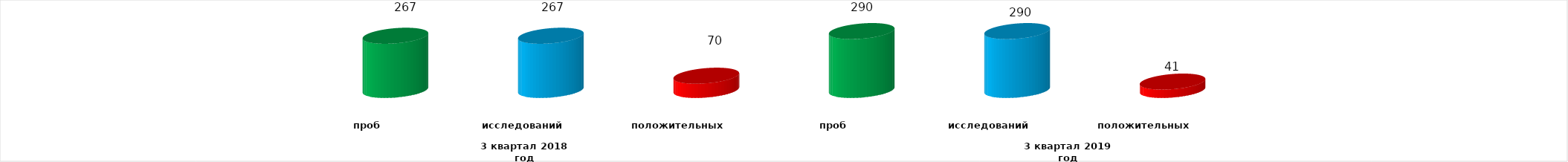
| Category | Series 4 |
|---|---|
| 0 | 267 |
| 1 | 267 |
| 2 | 70 |
| 3 | 290 |
| 4 | 290 |
| 5 | 41 |